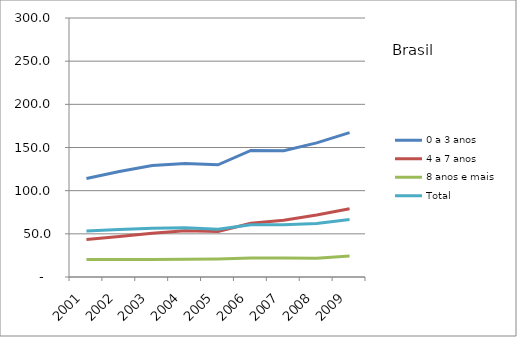
| Category | 0 a 3 anos | 4 a 7 anos | 8 anos e mais | Total |
|---|---|---|---|---|
| 2001.0 | 114.1 | 43.4 | 20.3 | 53.2 |
| 2002.0 | 122.1 | 47 | 20.3 | 54.9 |
| 2003.0 | 129.2 | 50.7 | 20.4 | 56.4 |
| 2004.0 | 131.5 | 53.6 | 20.6 | 57 |
| 2005.0 | 130 | 52.8 | 20.9 | 55.4 |
| 2006.0 | 146.6 | 62.2 | 21.9 | 60.6 |
| 2007.0 | 146.3 | 65.7 | 22.1 | 60.4 |
| 2008.0 | 155.3 | 71.9 | 21.6 | 62 |
| 2009.0 | 167.3 | 79.1 | 24.2 | 66.7 |